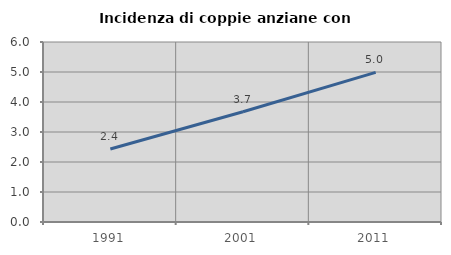
| Category | Incidenza di coppie anziane con figli |
|---|---|
| 1991.0 | 2.431 |
| 2001.0 | 3.675 |
| 2011.0 | 4.987 |